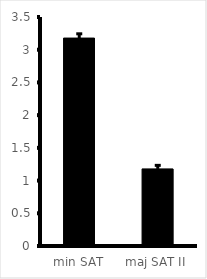
| Category | Series 0 |
|---|---|
| min SAT | 3.178 |
| maj SAT II | 1.178 |